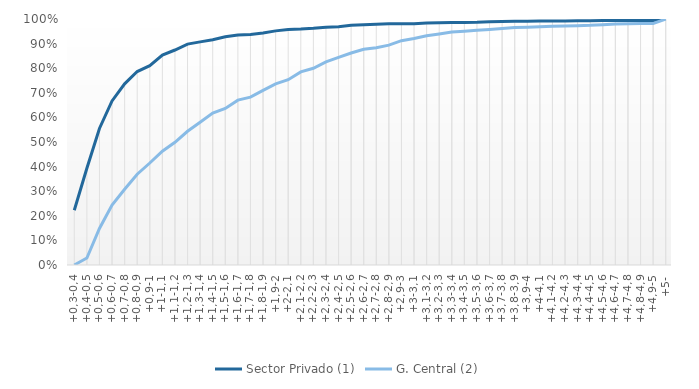
| Category | Sector Privado (1) | G. Central (2) |
|---|---|---|
| +0,3-0,4 | 0.223 | 0 |
| +0,4-0,5 | 0.393 | 0.028 |
| +0,5-0,6 | 0.555 | 0.148 |
| +0,6-0,7 | 0.667 | 0.243 |
| +0,7-0,8 | 0.736 | 0.308 |
| +0,8-0,9 | 0.787 | 0.369 |
| +0,9-1 | 0.81 | 0.415 |
| +1-1,1 | 0.853 | 0.463 |
| +1,1-1,2 | 0.874 | 0.499 |
| +1,2-1,3 | 0.898 | 0.544 |
| +1,3-1,4 | 0.907 | 0.58 |
| +1,4-1,5 | 0.916 | 0.618 |
| +1,5-1,6 | 0.928 | 0.636 |
| +1,6-1,7 | 0.935 | 0.67 |
| +1,7-1,8 | 0.937 | 0.682 |
| +1,8-1,9 | 0.943 | 0.71 |
| +1,9-2 | 0.952 | 0.737 |
| +2-2,1 | 0.957 | 0.753 |
| +2,1-2,2 | 0.959 | 0.785 |
| +2,2-2,3 | 0.962 | 0.8 |
| +2,3-2,4 | 0.967 | 0.826 |
| +2,4-2,5 | 0.969 | 0.844 |
| +2,5-2,6 | 0.974 | 0.862 |
| +2,6-2,7 | 0.977 | 0.877 |
| +2,7-2,8 | 0.979 | 0.883 |
| +2,8-2,9 | 0.98 | 0.894 |
| +2,9-3 | 0.981 | 0.912 |
| +3-3,1 | 0.981 | 0.92 |
| +3,1-3,2 | 0.984 | 0.932 |
| +3,2-3,3 | 0.985 | 0.939 |
| +3,3-3,4 | 0.985 | 0.947 |
| +3,4-3,5 | 0.986 | 0.95 |
| +3,5-3,6 | 0.987 | 0.955 |
| +3,6-3,7 | 0.988 | 0.957 |
| +3,7-3,8 | 0.99 | 0.961 |
| +3,8-3,9 | 0.99 | 0.965 |
| +3,9-4 | 0.991 | 0.967 |
| +4-4,1 | 0.991 | 0.968 |
| +4,1-4,2 | 0.991 | 0.971 |
| +4,2-4,3 | 0.992 | 0.972 |
| +4,3-4,4 | 0.993 | 0.973 |
| +4,4-4,5 | 0.993 | 0.974 |
| +4,5-4,6 | 0.993 | 0.977 |
| +4,6-4,7 | 0.994 | 0.98 |
| +4,7-4,8 | 0.994 | 0.98 |
| +4,8-4,9 | 0.994 | 0.981 |
| +4,9-5 | 0.994 | 0.982 |
| +5- | 1 | 1 |